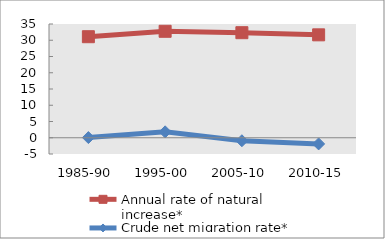
| Category | Annual rate of natural increase* | Crude net migration rate* |
|---|---|---|
| 1985-90 | 31.09 | 0.051 |
| 1995-00 | 32.755 | 1.818 |
| 2005-10 | 32.323 | -0.92 |
| 2010-15 | 31.664 | -1.895 |